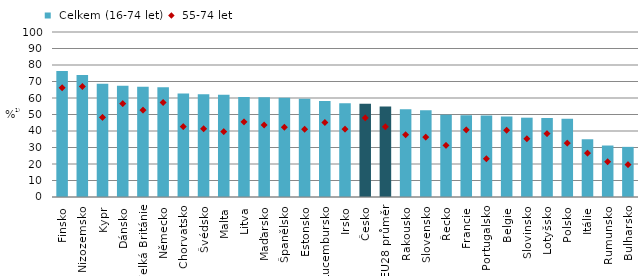
| Category |  Celkem (16-74 let) |
|---|---|
| Finsko | 76.324 |
| Nizozemsko | 73.973 |
| Kypr | 68.649 |
| Dánsko | 67.363 |
| Velká Británie | 66.889 |
| Německo | 66.494 |
| Chorvatsko | 62.772 |
| Švédsko | 62.24 |
| Malta | 62.016 |
| Litva | 60.635 |
| Maďarsko | 60.464 |
| Španělsko | 60.125 |
| Estonsko | 59.544 |
| Lucembursko | 58.171 |
| Irsko | 56.873 |
| Česko | 56.459 |
| EU28 průměr | 54.923 |
| Rakousko | 53.243 |
| Slovensko | 52.645 |
| Řecko | 49.863 |
| Francie | 49.589 |
| Portugalsko | 49.411 |
| Belgie | 48.745 |
| Slovinsko | 48.068 |
| Lotyšsko | 47.893 |
| Polsko | 47.399 |
| Itálie | 34.997 |
| Rumunsko | 31.2 |
| Bulharsko | 30.385 |